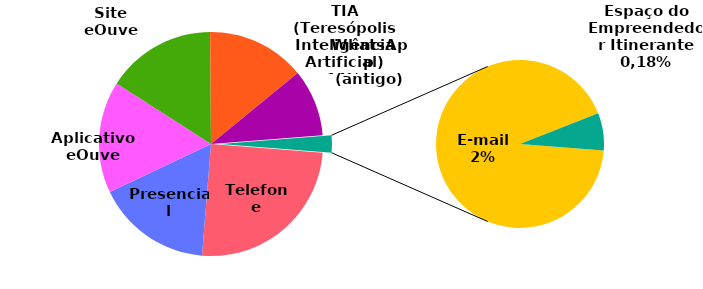
| Category | Series 0 |
|---|---|
| Telefone | 1257 |
| Presencial | 837 |
| Aplicativo eOuve | 809 |
| Site eOuve | 794 |
| TIA (Teresópolis Inteligência Artificial) | 713 |
| WhatsApp (antigo) | 486 |
| E-mail | 116 |
| Espaço do Empreendedor Itinerante | 9 |